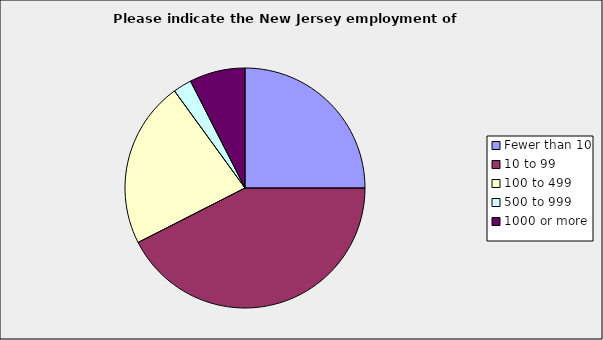
| Category | Series 0 |
|---|---|
| Fewer than 10 | 0.25 |
| 10 to 99 | 0.425 |
| 100 to 499 | 0.225 |
| 500 to 999 | 0.025 |
| 1000 or more | 0.075 |